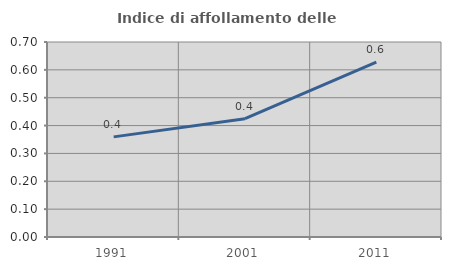
| Category | Indice di affollamento delle abitazioni  |
|---|---|
| 1991.0 | 0.359 |
| 2001.0 | 0.425 |
| 2011.0 | 0.627 |